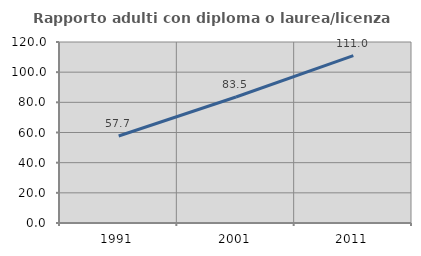
| Category | Rapporto adulti con diploma o laurea/licenza media  |
|---|---|
| 1991.0 | 57.673 |
| 2001.0 | 83.512 |
| 2011.0 | 110.989 |